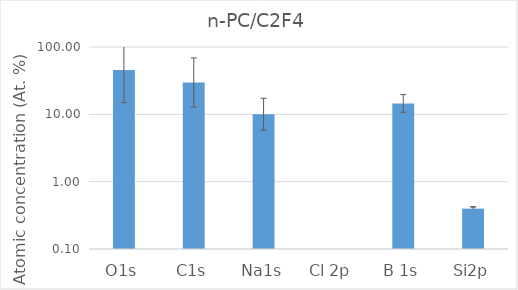
| Category | n-PC/C2F4 |
|---|---|
| O1s | 45.374 |
| C1s | 29.658 |
| Na1s | 10.049 |
| Cl 2p | 0 |
| B 1s | 14.521 |
| Si2p | 0.397 |